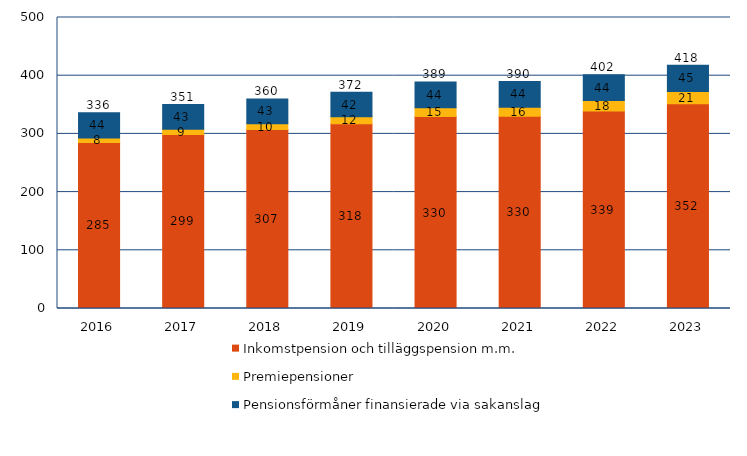
| Category | Inkomstpension och tilläggspension m.m. | Premiepensioner | Pensionsförmåner finansierade via sakanslag | Series 3 |
|---|---|---|---|---|
| 2016.0 | 285.357 | 7.598 | 43.541 | 336.496 |
| 2017.0 | 299.103 | 9.081 | 42.508 | 350.692 |
| 2018.0 | 307.356 | 10.141 | 42.538 | 360.035 |
| 2019.0 | 317.628 | 11.715 | 42.209 | 371.551 |
| 2020.0 | 329.769 | 15.069 | 44.443 | 389.281 |
| 2021.0 | 330.164 | 15.749 | 43.992 | 389.905 |
| 2022.0 | 339.308 | 18.225 | 44.232 | 401.765 |
| 2023.0 | 351.989 | 20.914 | 44.93 | 417.833 |